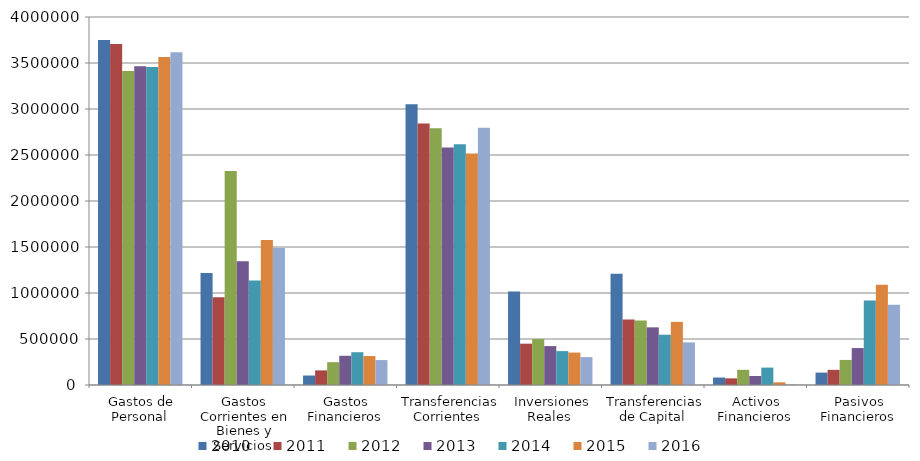
| Category | 2010 | 2011 | 2012 | 2013 | 2014 | 2015 | 2016 |
|---|---|---|---|---|---|---|---|
| Gastos de Personal  | 3750642.91 | 3706896.22 | 3413262.38 | 3464202.85 | 3455476.99 | 3565132.74 | 3616549.64 |
| Gastos Corrientes en Bienes y Servicios  | 1218484.74 | 953153.48 | 2327244.43 | 1343966.96 | 1135720.38 | 1575464.88 | 1487805.35 |
| Gastos Financieros  | 103190.25 | 159112.97 | 248050.42 | 317406.88 | 356247.77 | 314691.14 | 271119.43 |
| Transferencias Corrientes  | 3052957.83 | 2842747.35 | 2789747.61 | 2581941.7 | 2616669.09 | 2516237.28 | 2795248.38 |
| Inversiones Reales  | 1017421.75 | 449059.15 | 499528.28 | 422806.54 | 368223.22 | 352322.69 | 303183.8 |
| Transferencias de Capital  | 1210506.93 | 710792.21 | 701845.37 | 626745.55 | 546533.04 | 686168.16 | 463512.23 |
| Activos Financieros  | 81155.34 | 72142.83 | 164990.11 | 97883.81 | 189002.62 | 28977.78 | 6030.11 |
| Pasivos Financieros  | 134864.62 | 164735.11 | 272389.04 | 401825.44 | 919591.56 | 1090374.89 | 871306.4 |